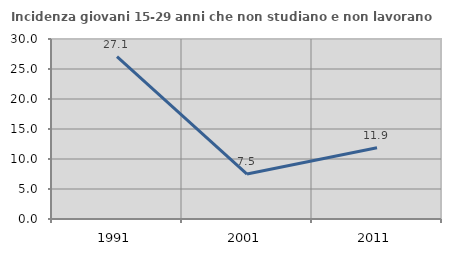
| Category | Incidenza giovani 15-29 anni che non studiano e non lavorano  |
|---|---|
| 1991.0 | 27.071 |
| 2001.0 | 7.491 |
| 2011.0 | 11.877 |